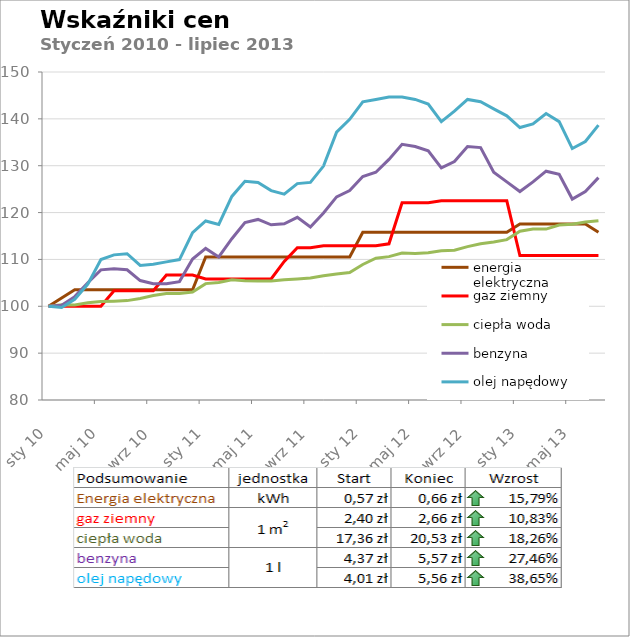
| Category | energia elektryczna | gaz ziemny | ciepła woda | benzyna | olej napędowy |
|---|---|---|---|---|---|
| 2010-01-01 | 100 | 100 | 100 | 100 | 100 |
| 2010-02-01 | 101.754 | 100 | 100.346 | 100.229 | 99.751 |
| 2010-03-01 | 103.509 | 100 | 100.288 | 102.059 | 101.496 |
| 2010-04-01 | 103.509 | 100 | 100.749 | 105.034 | 104.738 |
| 2010-05-01 | 103.509 | 100 | 101.037 | 107.78 | 109.975 |
| 2010-06-01 | 103.509 | 103.333 | 101.094 | 108.009 | 110.973 |
| 2010-07-01 | 103.509 | 103.333 | 101.21 | 107.78 | 111.222 |
| 2010-08-01 | 103.509 | 103.333 | 101.671 | 105.492 | 108.728 |
| 2010-09-01 | 103.509 | 103.333 | 102.304 | 104.805 | 108.978 |
| 2010-10-01 | 103.509 | 106.667 | 102.707 | 104.805 | 109.476 |
| 2010-11-01 | 103.509 | 106.667 | 102.707 | 105.263 | 109.975 |
| 2010-12-01 | 103.509 | 106.667 | 103.053 | 110.069 | 115.711 |
| 2011-01-01 | 110.526 | 105.833 | 104.839 | 112.357 | 118.204 |
| 2011-02-01 | 110.526 | 105.833 | 105.069 | 110.526 | 117.456 |
| 2011-03-01 | 110.526 | 105.833 | 105.645 | 114.416 | 123.441 |
| 2011-04-01 | 110.526 | 105.833 | 105.472 | 117.849 | 126.683 |
| 2011-05-01 | 110.526 | 105.833 | 105.415 | 118.535 | 126.434 |
| 2011-06-01 | 110.526 | 105.833 | 105.415 | 117.391 | 124.688 |
| 2011-07-01 | 110.526 | 109.583 | 105.645 | 117.62 | 123.94 |
| 2011-08-01 | 110.526 | 112.5 | 105.818 | 118.993 | 126.185 |
| 2011-09-01 | 110.526 | 112.5 | 106.048 | 116.934 | 126.434 |
| 2011-10-01 | 110.526 | 112.917 | 106.509 | 119.908 | 129.925 |
| 2011-11-01 | 110.526 | 112.917 | 106.912 | 123.341 | 137.157 |
| 2011-12-01 | 110.526 | 112.917 | 107.2 | 124.714 | 139.9 |
| 2012-01-01 | 115.789 | 112.917 | 108.929 | 127.689 | 143.641 |
| 2012-02-01 | 115.789 | 112.917 | 110.253 | 128.604 | 144.14 |
| 2012-03-01 | 115.789 | 113.333 | 110.599 | 131.35 | 144.638 |
| 2012-04-01 | 115.789 | 122.083 | 111.348 | 134.554 | 144.638 |
| 2012-05-01 | 115.789 | 122.083 | 111.29 | 134.096 | 144.14 |
| 2012-06-01 | 115.789 | 122.083 | 111.406 | 133.181 | 143.142 |
| 2012-07-01 | 115.789 | 122.5 | 111.866 | 129.519 | 139.401 |
| 2012-08-01 | 115.789 | 122.5 | 111.982 | 130.892 | 141.646 |
| 2012-09-01 | 115.789 | 122.5 | 112.73 | 134.096 | 144.14 |
| 2012-10-01 | 115.789 | 122.5 | 113.364 | 133.867 | 143.641 |
| 2012-11-01 | 115.789 | 122.5 | 113.71 | 128.604 | 142.145 |
| 2012-12-01 | 115.789 | 122.5 | 114.228 | 126.545 | 140.648 |
| 2013-01-01 | 117.544 | 110.833 | 116.014 | 124.485 | 138.155 |
| 2013-02-01 | 117.544 | 110.833 | 116.475 | 126.545 | 138.903 |
| 2013-03-01 | 117.544 | 110.833 | 116.475 | 128.833 | 141.147 |
| 2013-04-01 | 117.544 | 110.833 | 117.339 | 128.146 | 139.401 |
| 2013-05-01 | 117.544 | 110.833 | 117.512 | 122.883 | 133.666 |
| 2013-06-01 | 117.544 | 110.833 | 117.972 | 124.485 | 135.162 |
| 2013-07-01 | 115.789 | 110.833 | 118.26 | 127.46 | 138.653 |